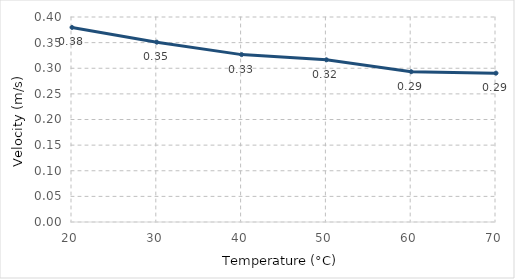
| Category | Velocity (m/s) |
|---|---|
| 20.0 | 0.38 |
| 30.0 | 0.351 |
| 40.0 | 0.327 |
| 50.0 | 0.317 |
| 60.0 | 0.293 |
| 70.0 | 0.29 |